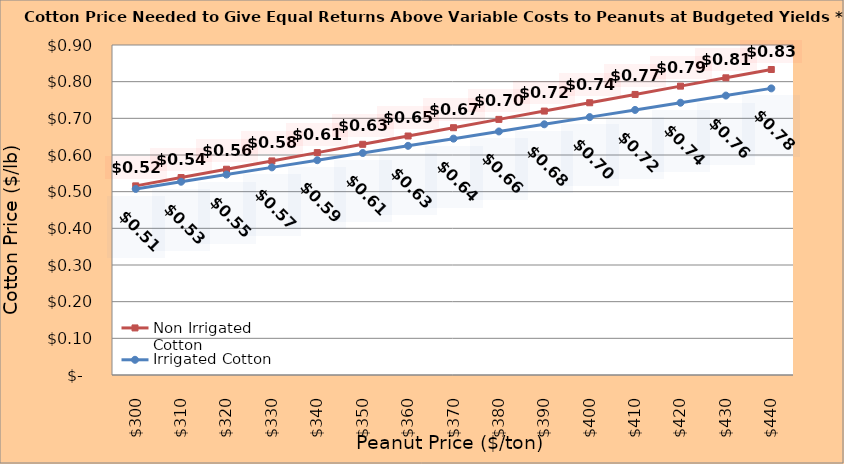
| Category | Non Irrigated Cotton | Irrigated Cotton |
|---|---|---|
| 299.8936170212766 | 0.516 | 0.508 |
| 309.8936170212766 | 0.538 | 0.527 |
| 319.8936170212766 | 0.561 | 0.547 |
| 329.8936170212766 | 0.584 | 0.566 |
| 339.8936170212766 | 0.606 | 0.586 |
| 349.8936170212766 | 0.629 | 0.605 |
| 359.8936170212766 | 0.652 | 0.625 |
| 369.8936170212766 | 0.674 | 0.645 |
| 379.8936170212766 | 0.697 | 0.664 |
| 389.8936170212766 | 0.72 | 0.684 |
| 399.8936170212766 | 0.742 | 0.703 |
| 409.8936170212766 | 0.765 | 0.723 |
| 419.8936170212766 | 0.788 | 0.743 |
| 429.8936170212766 | 0.81 | 0.762 |
| 439.8936170212766 | 0.833 | 0.782 |